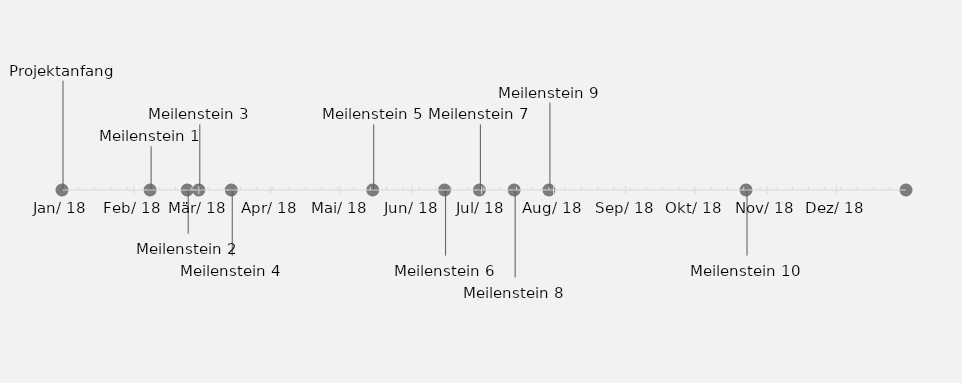
| Category | POSITION |
|---|---|
| Projektanfang | 25 |
| Meilenstein 1 | 10 |
| Meilenstein 2 | -10 |
| Meilenstein 3 | 15 |
| Meilenstein 4 | -15 |
| Meilenstein 5 | 15 |
| Meilenstein 6 | -15 |
| Meilenstein 7 | 15 |
| Meilenstein 8 | -20 |
| Meilenstein 9 | 20 |
| Meilenstein 10 | -15 |
| Projektende | 15 |